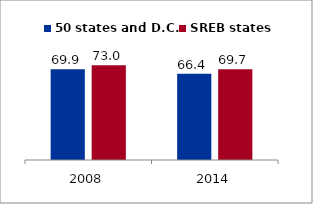
| Category | 50 states and D.C. | SREB states |
|---|---|---|
| 2008.0 | 69.854 | 72.976 |
| 2014.0 | 66.433 | 69.745 |